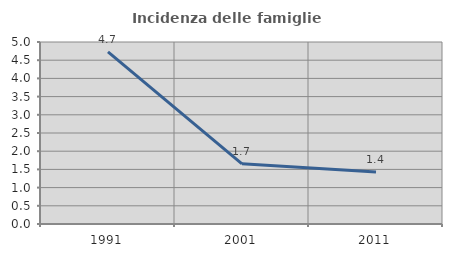
| Category | Incidenza delle famiglie numerose |
|---|---|
| 1991.0 | 4.727 |
| 2001.0 | 1.654 |
| 2011.0 | 1.429 |